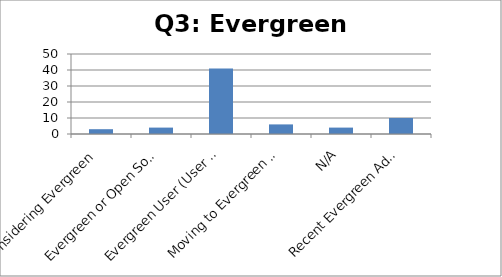
| Category | Response percent |
|---|---|
| Considering Evergreen | 3 |
| Evergreen or Open Source Enthusiast | 4 |
| Evergreen User (User for over 12 months) | 41 |
| Moving to Evergreen (In the next 12 months) | 6 |
| N/A | 4 |
| Recent Evergreen Adopter (in the past 12 months) | 10 |